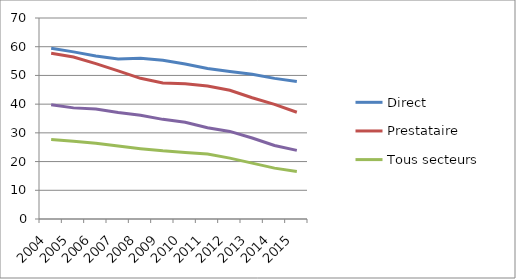
| Category | Direct | Prestataire | Tous secteurs | Services aux particuliers |
|---|---|---|---|---|
| 2004.0 | 59.5 | 57.7 | 27.7 | 39.8 |
| 2005.0 | 58.2 | 56.4 | 27.1 | 38.7 |
| 2006.0 | 56.8 | 54.1 | 26.4 | 38.3 |
| 2007.0 | 55.762 | 51.593 | 25.416 | 37.1 |
| 2008.0 | 56 | 49 | 24.5 | 36.1 |
| 2009.0 | 55.301 | 47.382 | 23.747 | 34.7 |
| 2010.0 | 53.959 | 47.12 | 23.177 | 33.7 |
| 2011.0 | 52.4 | 46.3 | 22.6 | 31.8 |
| 2012.0 | 51.384 | 44.839 | 21.209 | 30.5 |
| 2013.0 | 50.409 | 42.233 | 19.467 | 28.2 |
| 2014.0 | 48.974 | 39.936 | 17.718 | 25.6 |
| 2015.0 | 47.903 | 37.182 | 16.566 | 23.9 |